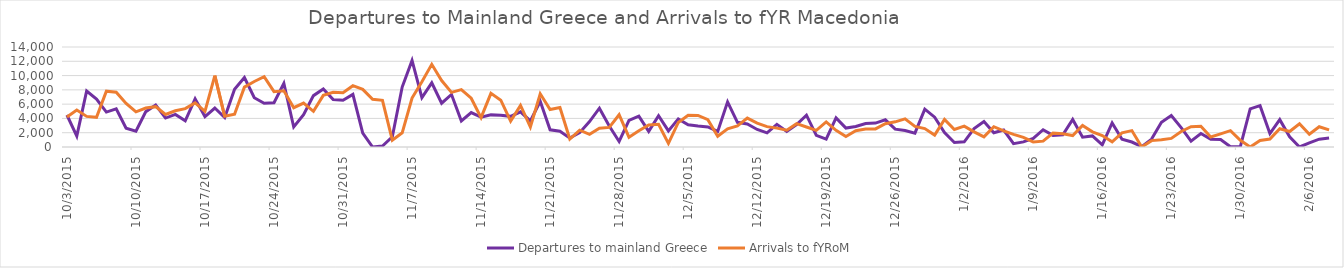
| Category | Departures to mainland Greece | Arrivals to fYRoM |
|---|---|---|
| 10/3/15 | 4480 | 4202 |
| 10/4/15 | 1513 | 5181 |
| 10/5/15 | 7833 | 4282 |
| 10/6/15 | 6707 | 4156 |
| 10/7/15 | 4886 | 7816 |
| 10/8/15 | 5349 | 7663 |
| 10/9/15 | 2631 | 6107 |
| 10/10/15 | 2214 | 4922 |
| 10/11/15 | 4950 | 5448 |
| 10/12/15 | 5879 | 5645 |
| 10/13/15 | 4052 | 4551 |
| 10/14/15 | 4564 | 5073 |
| 10/15/15 | 3660 | 5373 |
| 10/16/15 | 6743 | 6181 |
| 10/17/15 | 4239 | 4988 |
| 10/18/15 | 5457 | 10005 |
| 10/19/15 | 4119 | 4299 |
| 10/20/15 | 8083 | 4584 |
| 10/21/15 | 9725 | 8384 |
| 10/22/15 | 6896 | 9174 |
| 10/23/15 | 6120 | 9840 |
| 10/24/15 | 6195 | 7752 |
| 10/25/15 | 8916 | 7864 |
| 10/26/15 | 2804 | 5500 |
| 10/27/15 | 4540 | 6146 |
| 10/28/15 | 7191 | 5000 |
| 10/29/15 | 8117 | 7231 |
| 10/30/15 | 6649 | 7663 |
| 10/31/15 | 6537 | 7590 |
| 11/1/15 | 7360 | 8584 |
| 11/2/15 | 1935 | 8075 |
| 11/3/15 | 0 | 6682 |
| 11/4/15 | 142 | 6532 |
| 11/5/15 | 1430 | 960 |
| 11/6/15 | 8392 | 1987 |
| 11/7/15 | 12116 | 6847 |
| 11/8/15 | 6902 | 9148 |
| 11/9/15 | 8977 | 11572 |
| 11/10/15 | 6133 | 9305 |
| 11/11/15 | 7354 | 7651 |
| 11/12/15 | 3650 | 8038 |
| 11/13/15 | 4820 | 6826 |
| 11/14/15 | 4171 | 4107 |
| 11/15/15 | 4497 | 7511 |
| 11/16/15 | 4442 | 6557 |
| 11/17/15 | 4289 | 3621 |
| 11/18/15 | 4927 | 5831 |
| 11/19/15 | 3644 | 2816 |
| 11/20/15 | 6389 | 7453 |
| 11/21/15 | 2401 | 5255 |
| 11/22/15 | 2214 | 5539 |
| 11/23/15 | 1245 | 1113 |
| 11/24/15 | 2006 | 2347 |
| 11/25/15 | 3565 | 1779 |
| 11/26/15 | 5435 | 2617 |
| 11/27/15 | 2932 | 2744 |
| 11/28/15 | 778 | 4520 |
| 11/29/15 | 3736 | 1373 |
| 11/30/15 | 4318 | 2270 |
| 12/1/15 | 2181 | 3094 |
| 12/2/15 | 4384 | 3174 |
| 12/3/15 | 2255 | 494 |
| 12/4/15 | 3934 | 3436 |
| 12/5/15 | 3115 | 4430 |
| 12/6/15 | 2943 | 4425 |
| 12/7/15 | 2810 | 3826 |
| 12/8/15 | 2189 | 1508 |
| 12/9/15 | 6316 | 2550 |
| 12/10/15 | 3456 | 2956 |
| 12/11/15 | 3219 | 4047 |
| 12/12/15 | 2453 | 3338 |
| 12/13/15 | 1976 | 2849 |
| 12/14/15 | 3175 | 2644 |
| 12/15/15 | 2191 | 2349 |
| 12/16/15 | 3137 | 3264 |
| 12/17/15 | 4461 | 2801 |
| 12/18/15 | 1638 | 2332 |
| 12/19/15 | 1110 | 3515 |
| 12/20/15 | 4070 | 2338 |
| 12/21/15 | 2652 | 1470 |
| 12/22/15 | 2864 | 2272 |
| 12/23/15 | 3278 | 2529 |
| 12/24/15 | 3349 | 2529 |
| 12/25/15 | 3806 | 3268 |
| 12/26/15 | 2498 | 3521 |
| 12/27/15 | 2311 | 3938 |
| 12/28/15 | 1946 | 2884 |
| 12/29/15 | 5309 | 2577 |
| 12/30/15 | 4178 | 1665 |
| 12/31/15 | 2009 | 3848 |
| 1/1/16 | 623 | 2454 |
| 1/2/16 | 720 | 2918 |
| 1/3/16 | 2569 | 2112 |
| 1/4/16 | 3563 | 1415 |
| 1/5/16 | 1998 | 2842 |
| 1/6/16 | 2377 | 2258 |
| 1/7/16 | 463 | 1776 |
| 1/8/16 | 716 | 1344 |
| 1/9/16 | 1203 | 715 |
| 1/10/16 | 2417 | 819 |
| 1/11/16 | 1621 | 1959 |
| 1/12/16 | 1701 | 1840 |
| 1/13/16 | 3861 | 1600 |
| 1/14/16 | 1378 | 3022 |
| 1/15/16 | 1551 | 2119 |
| 1/16/16 | 301 | 1598 |
| 1/17/16 | 3378 | 720 |
| 1/18/16 | 1078 | 1980 |
| 1/19/16 | 695 | 2298 |
| 1/20/16 | 50 | 0 |
| 1/21/16 | 1108 | 892 |
| 1/22/16 | 3451 | 1030 |
| 1/23/16 | 4397 | 1208 |
| 1/24/16 | 2706 | 2174 |
| 1/25/16 | 819 | 2836 |
| 1/26/16 | 1887 | 2908 |
| 1/27/16 | 1098 | 1402 |
| 1/28/16 | 1046 | 1837 |
| 1/29/16 | 40 | 2292 |
| 1/30/16 | 53 | 931 |
| 1/31/16 | 5342 | 0 |
| 2/1/16 | 5783 | 908 |
| 2/2/16 | 1878 | 1121 |
| 2/3/16 | 3829 | 2558 |
| 2/4/16 | 1436 | 2173 |
| 2/5/16 | 0 | 3259 |
| 2/6/16 | 578 | 1780 |
| 2/7/16 | 1097 | 2838 |
| 2/8/16 | 1259 | 2392 |